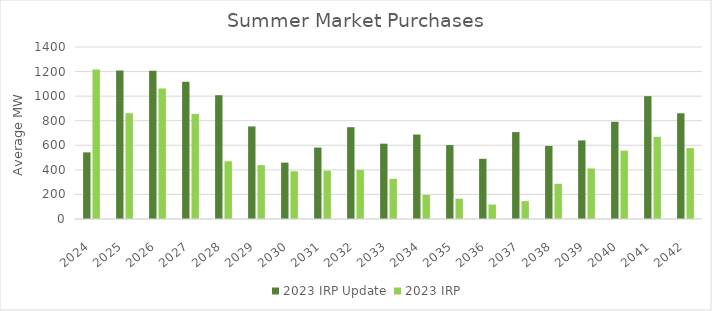
| Category | 2023 IRP Update | 2023 IRP |
|---|---|---|
| 2024.0 | 542.319 | 1217.182 |
| 2025.0 | 1209.16 | 860.929 |
| 2026.0 | 1207.059 | 1061.895 |
| 2027.0 | 1117.951 | 855.065 |
| 2028.0 | 1007.702 | 470.12 |
| 2029.0 | 753.391 | 438.282 |
| 2030.0 | 459.153 | 388.692 |
| 2031.0 | 581.622 | 393.286 |
| 2032.0 | 747.121 | 399.58 |
| 2033.0 | 613.221 | 326.998 |
| 2034.0 | 687.531 | 195.642 |
| 2035.0 | 601.656 | 165.519 |
| 2036.0 | 489.877 | 117.548 |
| 2037.0 | 707.268 | 145.645 |
| 2038.0 | 594.621 | 286.667 |
| 2039.0 | 639.949 | 411.527 |
| 2040.0 | 791.342 | 556.561 |
| 2041.0 | 999.857 | 668.835 |
| 2042.0 | 860.745 | 577.042 |